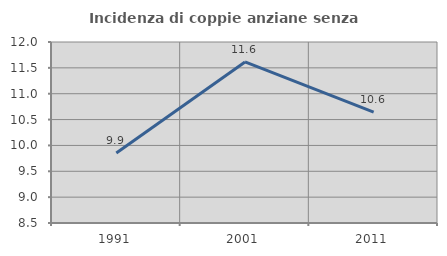
| Category | Incidenza di coppie anziane senza figli  |
|---|---|
| 1991.0 | 9.852 |
| 2001.0 | 11.615 |
| 2011.0 | 10.643 |